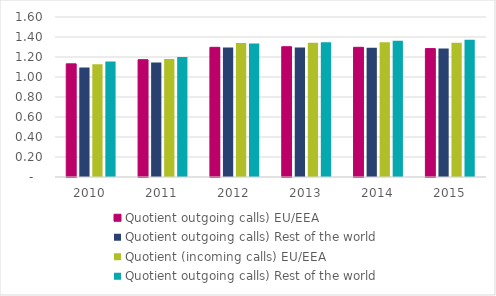
| Category | Quotient outgoing calls) EU/EEA | Quotient outgoing calls) Rest of the world | Quotient (incoming calls) EU/EEA |
|---|---|---|---|
| 2010.0 | 1.131 | 1.156 | 1.128 |
| 2011.0 | 1.173 | 1.2 | 1.18 |
| 2012.0 | 1.297 | 1.335 | 1.341 |
| 2013.0 | 1.303 | 1.348 | 1.342 |
| 2014.0 | 1.297 | 1.364 | 1.349 |
| 2015.0 | 1.284 | 1.372 | 1.341 |